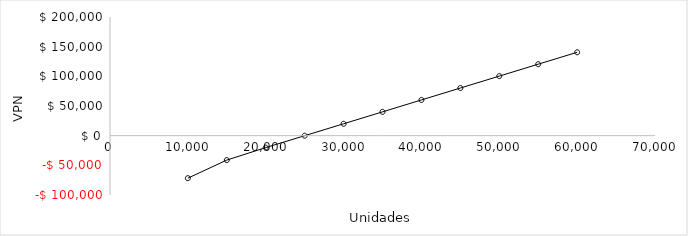
| Category | Series 0 |
|---|---|
| 10000.0 | -71648.179 |
| 15000.0 | -41148.829 |
| 20000.0 | -20135.191 |
| 25000.0 | -52.37 |
| 30000.0 | 20030.45 |
| 35000.0 | 40113.271 |
| 40000.0 | 60196.091 |
| 45000.0 | 80278.911 |
| 50000.0 | 100361.732 |
| 55000.0 | 120444.552 |
| 60000.0 | 140527.372 |